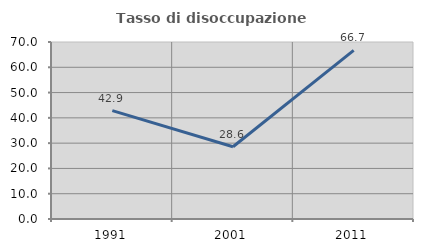
| Category | Tasso di disoccupazione giovanile  |
|---|---|
| 1991.0 | 42.857 |
| 2001.0 | 28.571 |
| 2011.0 | 66.667 |